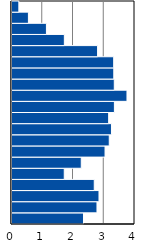
| Category | Series 0 |
|---|---|
| 0-4 | 2.325 |
| 5-9 | 2.763 |
| 10-14 | 2.829 |
| 15-19 | 2.675 |
| 20-24 | 1.699 |
| 25-29 | 2.253 |
| 30-34 | 3.025 |
| 35-39 | 3.163 |
| 40-44 | 3.235 |
| 45-49 | 3.143 |
| 50-54 | 3.33 |
| 55-59 | 3.739 |
| 60-64 | 3.327 |
| 65-69 | 3.31 |
| 70-74 | 3.307 |
| 75-79 | 2.783 |
| 80-84 | 1.703 |
| 85-89 | 1.12 |
| 90-94 | 0.534 |
| 95+ | 0.223 |